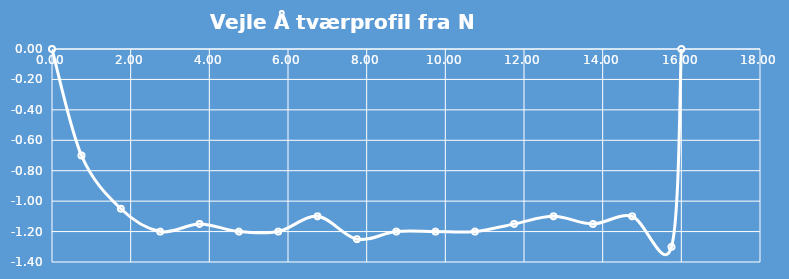
| Category | Series 0 |
|---|---|
| 0.0 | 0 |
| 0.75 | -0.7 |
| 1.75 | -1.05 |
| 2.75 | -1.2 |
| 3.75 | -1.15 |
| 4.75 | -1.2 |
| 5.75 | -1.2 |
| 6.75 | -1.1 |
| 7.75 | -1.25 |
| 8.75 | -1.2 |
| 9.75 | -1.2 |
| 10.75 | -1.2 |
| 11.75 | -1.15 |
| 12.75 | -1.1 |
| 13.75 | -1.15 |
| 14.75 | -1.1 |
| 15.75 | -1.3 |
| 16.0 | 0 |